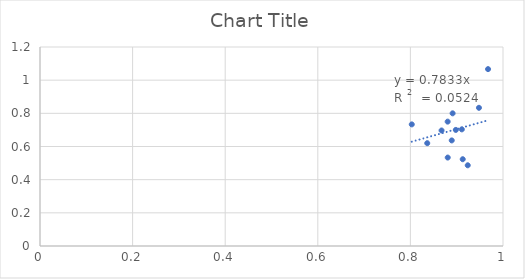
| Category | Series 0 |
|---|---|
| 0.9480707844121886 | 0.833 |
| 0.8911794906181427 | 0.8 |
| 0.9676863122686724 | 1.067 |
| 0.8806110973901634 | 0.533 |
| 0.8804977706871422 | 0.75 |
| 0.923849383538726 | 0.487 |
| 0.8673213562308273 | 0.697 |
| 0.8981113719797189 | 0.7 |
| 0.9130284992829035 | 0.523 |
| 0.8029603179025353 | 0.733 |
| 0.8363732139759085 | 0.62 |
| 0.9110701517887206 | 0.703 |
| 0.8892884148457209 | 0.637 |